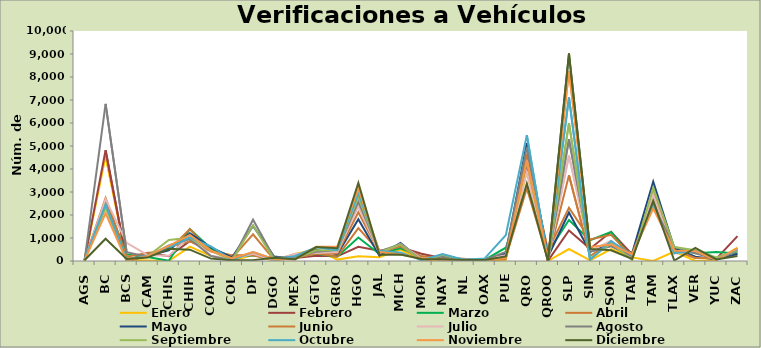
| Category | Enero | Febrero | Marzo | Abril | Mayo | Junio | Julio | Agosto | Septiembre | Octubre | Noviembre | Diciembre |
|---|---|---|---|---|---|---|---|---|---|---|---|---|
| AGS | 42 | 39 | 18 | 52 | 43 | 22 | 21 | 21 | 0 | 62 | 24 | 34 |
| BC | 4561 | 4816 | 2620 | 2740 | 2548 | 2558 | 2688 | 6827 | 2318 | 2465 | 2077 | 968 |
| BCS | 55 | 2 | 288 | 190 | 5 | 114 | 790 | 379 | 40 | 47 | 3 | 84 |
| CAM | 26 | 353 | 176 | 352 | 220 | 176 | 252 | 185 | 201 | 238 | 224 | 147 |
| CHIS | 0 | 206 | 8 | 484 | 459 | 614 | 226 | 677 | 914 | 577 | 657 | 532 |
| CHIH | 622 | 861 | 1391 | 1381 | 1204 | 850 | 1068 | 957 | 1009 | 1016 | 1137 | 494 |
| COAH | 220 | 473 | 545 | 423 | 594 | 422 | 227 | 218 | 448 | 632 | 439 | 103 |
| COL | 14 | 211 | 183 | 254 | 152 | 126 | 76 | 25 | 23 | 46 | 106 | 32 |
| DF | 255 | 258 | 254 | 252 | 1527 | 1162 | 311 | 1797 | 1552 | 390 | 392 | 37 |
| DGO | 20 | 118 | 120 | 34 | 193 | 62 | 38 | 146 | 60 | 71 | 90 | 140 |
| MEX | 308 | 128 | 158 | 146 | 94 | 163 | 315 | 181 | 103 | 219 | 66 | 80 |
| GTO | 510 | 224 | 316 | 331 | 483 | 320 | 348 | 403 | 467 | 597 | 620 | 607 |
| GRO | 61 | 202 | 188 | 186 | 293 | 331 | 392 | 471 | 471 | 472 | 634 | 552 |
| HGO | 203 | 617 | 1021 | 1428 | 1820 | 2120 | 2379 | 2576 | 2784 | 2947 | 3144 | 3393 |
| JAL | 165 | 441 | 306 | 410 | 231 | 355 | 342 | 413 | 378 | 436 | 389 | 273 |
| MICH | 495 | 597 | 548 | 642 | 785 | 652 | 744 | 734 | 717 | 375 | 282 | 284 |
| MOR | 20 | 312 | 191 | 203 | 54 | 28 | 95 | 31 | 11 | 37 | 116 | 83 |
| NAY | 72 | 120 | 97 | 120 | 137 | 134 | 174 | 181 | 274 | 300 | 33 | 76 |
| NL | 28 | 22 | 47 | 35 | 72 | 103 | 90 | 75 | 43 | 57 | 41 | 41 |
| OAX | 16 | 39 | 51 | 41 | 38 | 27 | 66 | 45 | 33 | 113 | 18 | 43 |
| PUE | 56 | 330 | 577 | 99 | 324 | 147 | 256 | 399 | 172 | 1122 | 141 | 197 |
| QRO | 3894 | 4215 | 3221 | 4655 | 5130 | 3162 | 3899 | 4952 | 4340 | 5474 | 4371 | 3371 |
| QROO | 0 | 4 | 383 | 448 | 177 | 77 | 97 | 79 | 58 | 59 | 60 | 0 |
| SLP | 521 | 1327 | 1785 | 2319 | 2107 | 3727 | 4587 | 5288 | 5994 | 7111 | 8258 | 9022 |
| SIN | 31 | 535 | 903 | 941 | 402 | 210 | 433 | 406 | 92 | 47 | 614 | 525 |
| SON | 520 | 1271 | 1267 | 1138 | 720 | 811 | 883 | 637 | 771 | 871 | 721 | 468 |
| TAB | 158 | 286 | 102 | 165 | 344 | 323 | 78 | 210 | 44 | 251 | 285 | 93 |
| TAM | 0 | 2999 | 2912 | 2952 | 3453 | 2611 | 2894 | 2425 | 3183 | 2428 | 2282 | 2609 |
| TLAX | 414 | 547 | 525 | 486 | 566 | 484 | 322 | 612 | 608 | 345 | 456 | 21 |
| VER | 0 | 434 | 336 | 135 | 183 | 132 | 423 | 335 | 464 | 441 | 433 | 567 |
| YUC | 41 | 101 | 391 | 120 | 79 | 134 | 78 | 83 | 158 | 59 | 41 | 66 |
| ZAC | 579 | 1082 | 328 | 480 | 304 | 463 | 486 | 422 | 468 | 516 | 560 | 217 |